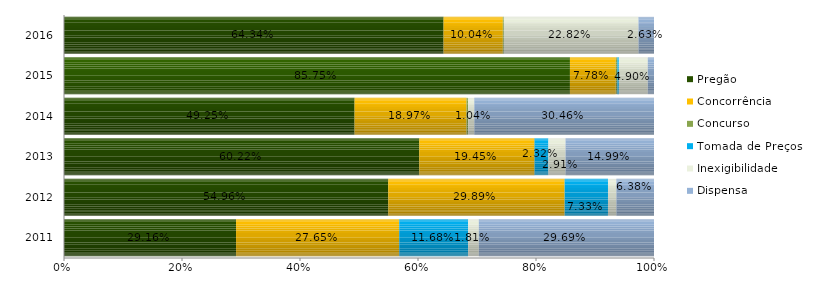
| Category | Pregão | Concorrência | Concurso | Tomada de Preços | Inexigibilidade | Dispensa |
|---|---|---|---|---|---|---|
| 2011.0 | 0.292 | 0.277 | 0 | 0.117 | 0.018 | 0.297 |
| 2012.0 | 0.55 | 0.299 | 0 | 0.073 | 0.014 | 0.064 |
| 2013.0 | 0.602 | 0.195 | 0.001 | 0.023 | 0.029 | 0.15 |
| 2014.0 | 0.493 | 0.19 | 0.003 | 0 | 0.01 | 0.305 |
| 2015.0 | 0.858 | 0.078 | 0.003 | 0.002 | 0.049 | 0.011 |
| 2016.0 | 0.643 | 0.1 | 0.002 | 0 | 0.228 | 0.026 |